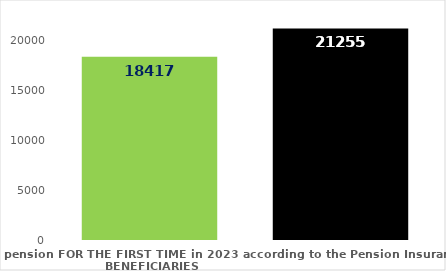
| Category | broj korisnika |
|---|---|
| Pension beneficiaries entitled to pension FOR THE FIRST TIME in 2023 according to the Pension Insurance Act  - NEW BENEFICIARIES | 18417 |
| Pension beneficiaries whose pension entitlement ceased in 2023  -  death caused,   
and who were retired according to the Pension Insurance Act   | 21255 |